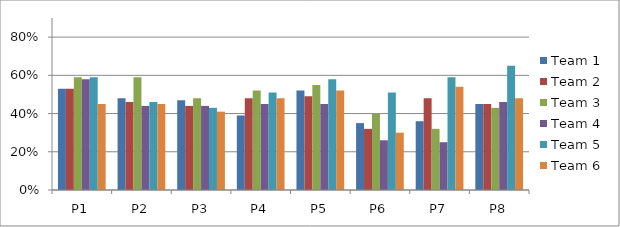
| Category | Team 1 | Team 2 | Team 3 | Team 4 | Team 5 | Team 6 |
|---|---|---|---|---|---|---|
| P1 | 0.53 | 0.53 | 0.59 | 0.58 | 0.59 | 0.45 |
| P2 | 0.48 | 0.46 | 0.59 | 0.44 | 0.46 | 0.45 |
| P3 | 0.47 | 0.44 | 0.48 | 0.44 | 0.43 | 0.41 |
| P4 | 0.39 | 0.48 | 0.52 | 0.45 | 0.51 | 0.48 |
| P5 | 0.52 | 0.49 | 0.55 | 0.45 | 0.58 | 0.52 |
| P6 | 0.35 | 0.32 | 0.4 | 0.26 | 0.51 | 0.3 |
| P7 | 0.36 | 0.48 | 0.32 | 0.25 | 0.59 | 0.54 |
| P8 | 0.45 | 0.45 | 0.43 | 0.46 | 0.65 | 0.48 |